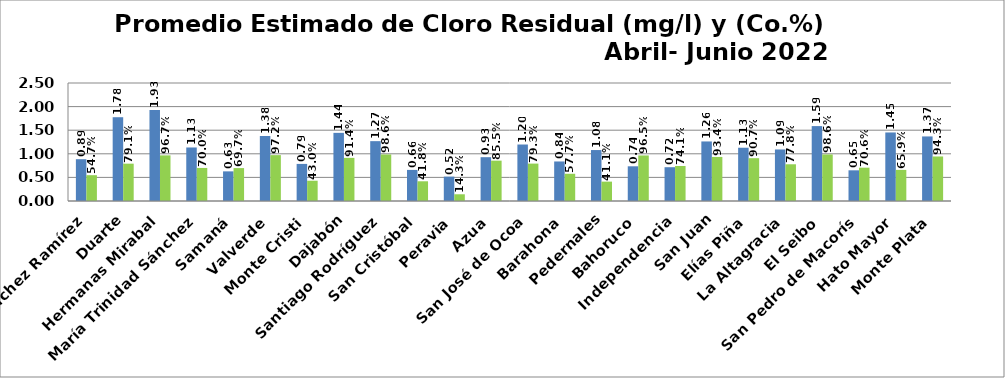
| Category | PROMEDIO TRIMESTRAL (mg/l) | PROMEDIO TRIMESTRAL (Co.%) |
|---|---|---|
| Sánchez Ramírez | 0.886 | 0.547 |
| Duarte | 1.775 | 0.791 |
| Hermanas Mirabal | 1.928 | 0.967 |
| María Trinidad Sánchez | 1.134 | 0.7 |
| Samaná | 0.628 | 0.697 |
| Valverde | 1.377 | 0.972 |
| Monte Cristi | 0.786 | 0.43 |
| Dajabón | 1.444 | 0.914 |
| Santiago Rodríguez | 1.268 | 0.986 |
| San Cristóbal | 0.659 | 0.418 |
| Peravia | 0.517 | 0.142 |
| Azua | 0.928 | 0.855 |
| San José de Ocoa | 1.197 | 0.792 |
| Barahona | 0.837 | 0.577 |
| Pedernales | 1.08 | 0.411 |
| Bahoruco | 0.735 | 0.965 |
| Independencia | 0.716 | 0.741 |
| San Juan | 1.262 | 0.934 |
| Elías Piña | 1.128 | 0.907 |
| La Altagracia | 1.092 | 0.778 |
| El Seibo | 1.587 | 0.986 |
| San Pedro de Macorís | 0.65 | 0.706 |
| Hato Mayor | 1.452 | 0.659 |
| Monte Plata | 1.368 | 0.943 |